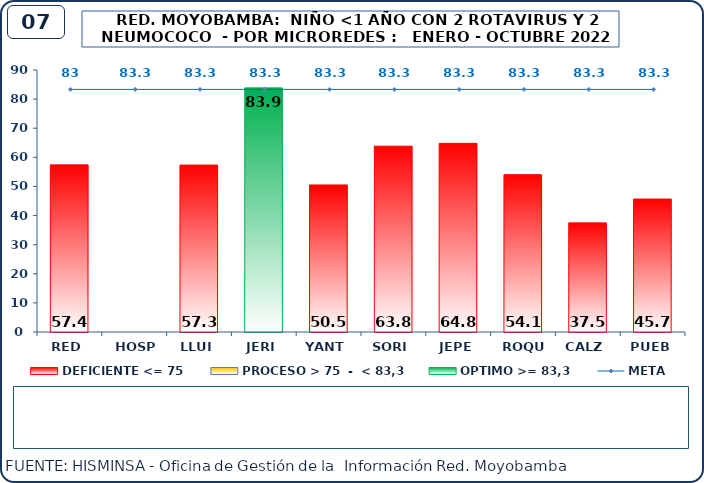
| Category | DEFICIENTE <= 75 | PROCESO > 75  -  < 83,3 | OPTIMO >= 83,3 |
|---|---|---|---|
| RED | 57.43 | 0 | 0 |
| HOSP | 0 | 0 | 0 |
| LLUI | 57.33 | 0 | 0 |
| JERI | 0 | 0 | 83.87 |
| YANT | 50.51 | 0 | 0 |
| SORI | 63.83 | 0 | 0 |
| JEPE | 64.8 | 0 | 0 |
| ROQU | 54.05 | 0 | 0 |
| CALZ | 37.5 | 0 | 0 |
| PUEB | 45.68 | 0 | 0 |